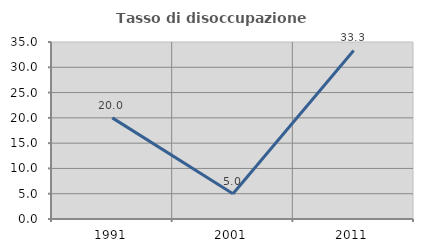
| Category | Tasso di disoccupazione giovanile  |
|---|---|
| 1991.0 | 20 |
| 2001.0 | 5 |
| 2011.0 | 33.333 |